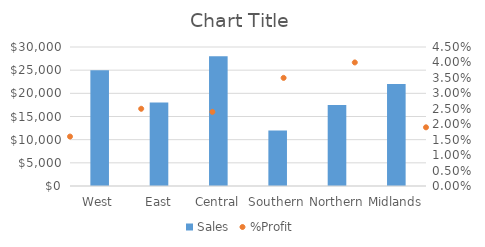
| Category | Sales |
|---|---|
| West | 25000 |
| East | 18000 |
| Central | 28000 |
| Southern | 12000 |
| Northern | 17500 |
| Midlands | 22000 |